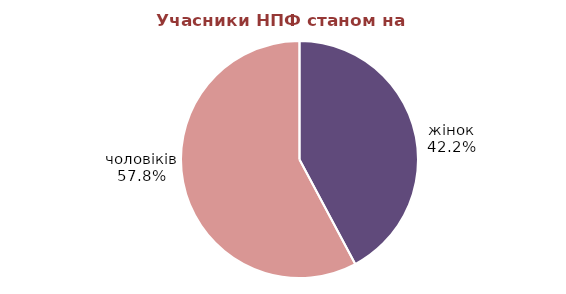
| Category | Series 0 |
|---|---|
| жінок | 369675 |
| чоловіків | 506263 |